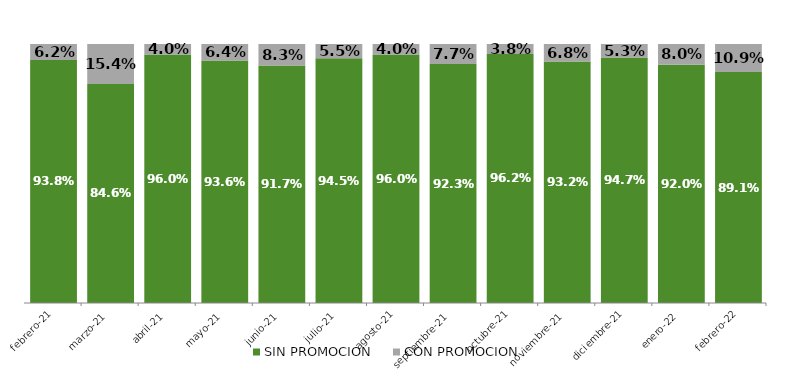
| Category | SIN PROMOCION   | CON PROMOCION   |
|---|---|---|
| 2021-02-01 | 0.938 | 0.062 |
| 2021-03-01 | 0.846 | 0.154 |
| 2021-04-01 | 0.96 | 0.04 |
| 2021-05-01 | 0.936 | 0.064 |
| 2021-06-01 | 0.917 | 0.083 |
| 2021-07-01 | 0.945 | 0.055 |
| 2021-08-01 | 0.96 | 0.04 |
| 2021-09-01 | 0.923 | 0.077 |
| 2021-10-01 | 0.962 | 0.038 |
| 2021-11-01 | 0.932 | 0.068 |
| 2021-12-01 | 0.947 | 0.053 |
| 2022-01-01 | 0.92 | 0.08 |
| 2022-02-01 | 0.891 | 0.109 |